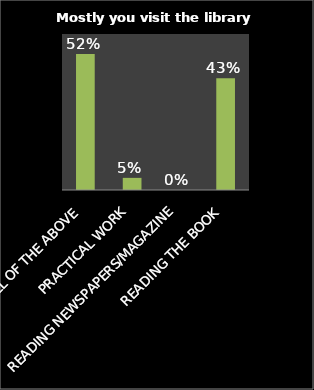
| Category | Series 0 |
|---|---|
| ALL OF THE ABOVE | 0.523 |
| PRACTICAL WORK | 0.047 |
| READING NEWSPAPERS/MAGAZINE | 0 |
| READING THE BOOK | 0.43 |